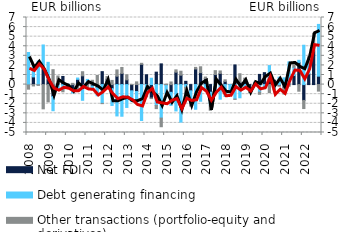
| Category | Net FDI | Debt generating financing | Other transactions (portfolio-equity and derivatives) |
|---|---|---|---|
| 2008.0 | -0.033 | 3.349 | -0.445 |
| 2008.0 | 0.803 | 1.088 | -0.143 |
| 2008.0 | -0.018 | 2.453 | -0.057 |
| 2008.0 | 1.693 | 2.442 | -2.531 |
| 2009.0 | 0.563 | 1.76 | -1.808 |
| 2009.0 | -1.245 | -1.481 | 1.555 |
| 2009.0 | 0.091 | -0.441 | 0.803 |
| 2009.0 | 0.849 | -0.524 | -0.23 |
| 2010.0 | -0.209 | 0.064 | 0.002 |
| 2010.0 | -0.422 | -0.45 | 0.129 |
| 2010.0 | 0.55 | 0.133 | -0.583 |
| 2010.0 | 0.916 | -1.641 | 0.426 |
| 2011.0 | 0.212 | 0.326 | -0.276 |
| 2011.0 | -0.157 | -0.266 | 0.447 |
| 2011.0 | -0.329 | -0.835 | 0.948 |
| 2011.0 | 1.349 | -1.961 | -0.027 |
| 2012.0 | 0.56 | -0.353 | 0.275 |
| 2012.0 | -0.417 | -1.763 | 0.435 |
| 2012.0 | 0.874 | -3.272 | 0.657 |
| 2012.0 | 1.166 | -3.304 | 0.621 |
| 2013.0 | 0.497 | -2.385 | 0.521 |
| 2013.0 | -0.651 | -1.108 | 0.016 |
| 2013.0 | -0.73 | -1.279 | 0.283 |
| 2013.0 | 2.115 | -3.746 | 0.106 |
| 2014.0 | 1.023 | -0.891 | -0.381 |
| 2014.0 | -1.403 | 0.662 | -0.06 |
| 2014.0 | 1.296 | -2.179 | -0.328 |
| 2014.0 | 2.162 | -3.495 | -0.903 |
| 2015.0 | -0.029 | -0.895 | 0.05 |
| 2015.0 | -0.806 | -1.363 | 0.273 |
| 2015.0 | 1.293 | -2.748 | 0.242 |
| 2015.0 | 0.981 | -3.918 | 0.413 |
| 2016.0 | 0.34 | -0.282 | -0.707 |
| 2016.0 | -0.651 | -1.305 | -0.283 |
| 2016.0 | 1.63 | -2.575 | 0.164 |
| 2016.0 | 1.244 | -1.739 | 0.616 |
| 2017.0 | 0.616 | -0.382 | 0.171 |
| 2017.0 | -0.797 | -1.326 | -0.56 |
| 2017.0 | 1.054 | -0.941 | 0.4 |
| 2017.0 | 1.164 | -1.523 | 0.258 |
| 2018.0 | 0.329 | -1.244 | 0.168 |
| 2018.0 | 0 | -0.633 | -0.193 |
| 2018.0 | 2.05 | -1.506 | -0.041 |
| 2018.0 | 0.233 | -1.376 | 0.896 |
| 2019.0 | 0.383 | -0.202 | 0.289 |
| 2019.0 | -0.588 | -0.016 | -0.247 |
| 2019.0 | 0.099 | 0.136 | 0.012 |
| 2019.0 | 1.061 | -0.786 | -0.229 |
| 2020.0 | 1.242 | -0.348 | -0.1 |
| 2020.0 | 0.774 | 1.21 | -0.836 |
| 2020.0 | 0.451 | -0.418 | -0.134 |
| 2020.0 | -0.117 | 0.77 | -0.046 |
| 2021.0 | -0.36 | 0.704 | -0.634 |
| 2021.0 | 0.056 | 2.314 | -0.167 |
| 2021.0 | 0.952 | 0.855 | 0.452 |
| 2021.0 | 2.311 | 0.222 | -0.691 |
| 2022.0 | -1.654 | 4.107 | -0.847 |
| 2022.0 | 1.127 | 1.02 | 0.754 |
| 2022.0 | 3.522 | 0.486 | 1.348 |
| 2022.0 | 0.88 | 5.399 | -0.682 |